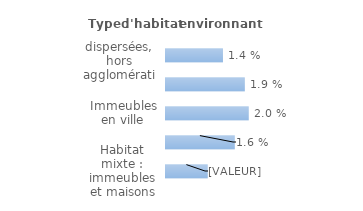
| Category | Series 0 |
|---|---|
| Maisons dispersées, hors agglomération | 0.014 |
| Maisons en lotissement, en quartier pavillonnaire | 0.019 |
| Immeubles en ville | 0.02 |
| Immeubles en cité ou grand ensemble | 0.016 |
| Habitat mixte : immeubles et maisons | 0.01 |